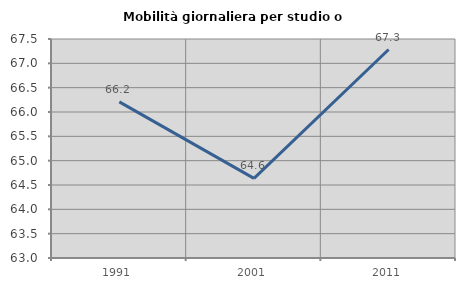
| Category | Mobilità giornaliera per studio o lavoro |
|---|---|
| 1991.0 | 66.209 |
| 2001.0 | 64.635 |
| 2011.0 | 67.284 |